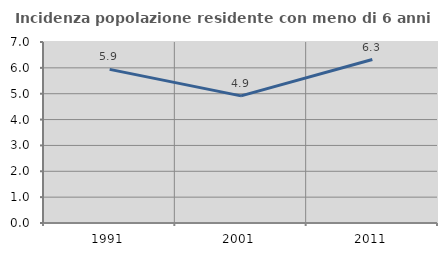
| Category | Incidenza popolazione residente con meno di 6 anni |
|---|---|
| 1991.0 | 5.941 |
| 2001.0 | 4.915 |
| 2011.0 | 6.323 |